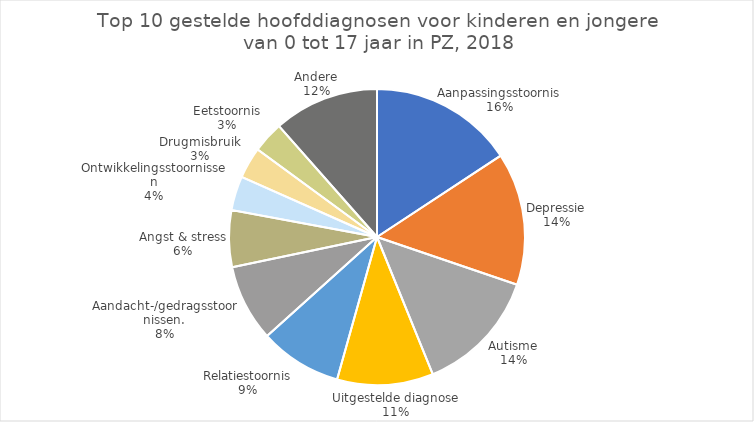
| Category | Aantal verblijven |
|---|---|
| Aanpassingsstoornis | 447 |
| Depressie | 411 |
| Autisme | 387 |
| Uitgestelde diagnose | 298 |
| Relatiestoornis | 255 |
| Aandacht-/gedragsstoornissen. | 238 |
| Angst & stress | 176 |
| Ontwikkelingsstoornissen | 106 |
| Drugmisbruik | 97 |
| Eetstoornis | 97 |
| Andere | 327 |